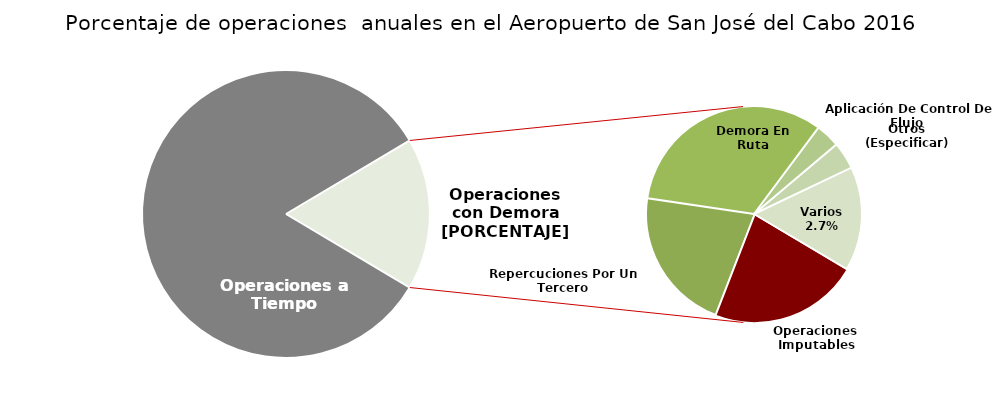
| Category | Series 0 |
|---|---|
| Operaciones a Tiempo | 13907 |
| Operaciones Imputables | 639 |
| Repercuciones Por Un Tercero | 614 |
| Demora En Ruta | 940 |
| Aplicación De Control De Flujo  | 104 |
| Otros (Especificar) | 117 |
| Varios | 446 |